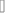
| Category | #REF! |
|---|---|
| 0.0485 | 0.063 |
| 0.0482 | 0.063 |
| 0.0472 | 0.063 |
| 0.0487 | 0.064 |
| 0.049 | 0.064 |
| 0.052 | 0.067 |
| 0.0511 | 0.066 |
| 0.0493 | 0.066 |
| 0.0479 | 0.066 |
| 0.0477 | 0.065 |
| 0.0452 | 0.064 |
| 0.0453 | 0.066 |
| 0.0433 | 0.065 |
| 0.0452 | 0.068 |
| 0.0439 | 0.069 |
| 0.0444 | 0.07 |
| 0.046 | 0.069 |
| 0.0469 | 0.071 |
| 0.0457 | 0.072 |
| 0.045 | 0.072 |
| 0.0427 | 0.073 |
| 0.0417 | 0.089 |
| 0.04 | 0.092 |
| 0.0287 | 0.084 |
| 0.0313 | 0.081 |
| 0.0359 | 0.081 |
| 0.0364 | 0.084 |
| 0.0376 | 0.084 |
| 0.0423 | 0.081 |
| 0.0452 | 0.075 |
| 0.0441 | 0.071 |
| 0.0437 | 0.066 |
| 0.0419 | 0.063 |
| 0.0419 | 0.063 |
| 0.0431 | 0.063 |
| 0.0449 | 0.064 |
| 0.046 | 0.062 |
| 0.0462 | 0.063 |
| 0.0464 | 0.063 |
| 0.0469 | 0.062 |
| 0.0429 | 0.06 |
| 0.0413 | 0.062 |
| 0.0399 | 0.06 |
| 0.038 | 0.057 |
| 0.0377 | 0.057 |
| 0.0387 | 0.057 |
| 0.0419 | 0.059 |
| 0.0442 | 0.061 |
| 0.0452 | 0.061 |
| 0.0465 | 0.062 |
| 0.0451 | 0.06 |